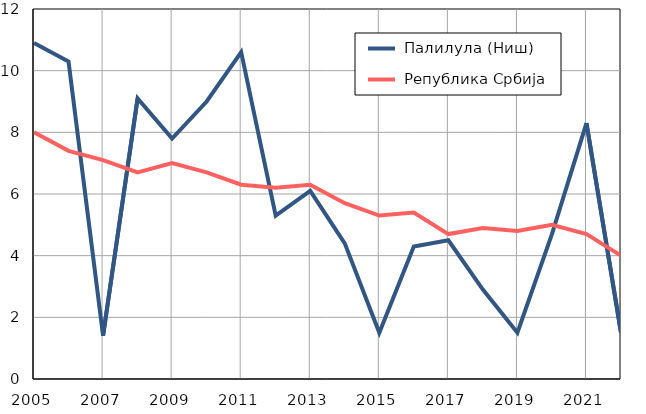
| Category |  Палилула (Ниш) |  Република Србија |
|---|---|---|
| 2005.0 | 10.9 | 8 |
| 2006.0 | 10.3 | 7.4 |
| 2007.0 | 1.4 | 7.1 |
| 2008.0 | 9.1 | 6.7 |
| 2009.0 | 7.8 | 7 |
| 2010.0 | 9 | 6.7 |
| 2011.0 | 10.6 | 6.3 |
| 2012.0 | 5.3 | 6.2 |
| 2013.0 | 6.1 | 6.3 |
| 2014.0 | 4.4 | 5.7 |
| 2015.0 | 1.5 | 5.3 |
| 2016.0 | 4.3 | 5.4 |
| 2017.0 | 4.5 | 4.7 |
| 2018.0 | 2.9 | 4.9 |
| 2019.0 | 1.5 | 4.8 |
| 2020.0 | 4.7 | 5 |
| 2021.0 | 8.3 | 4.7 |
| 2022.0 | 1.5 | 4 |